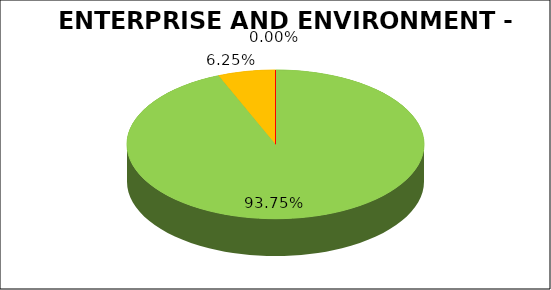
| Category | Series 0 |
|---|---|
| Green | 0.938 |
| Amber | 0.062 |
| Red | 0 |